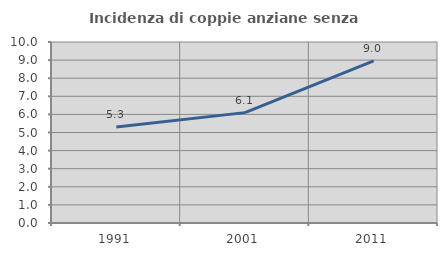
| Category | Incidenza di coppie anziane senza figli  |
|---|---|
| 1991.0 | 5.308 |
| 2001.0 | 6.098 |
| 2011.0 | 8.959 |